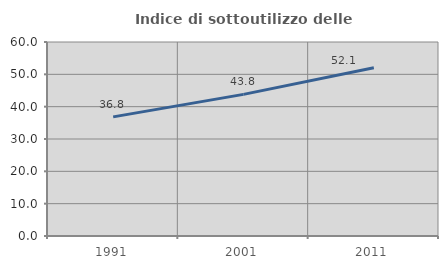
| Category | Indice di sottoutilizzo delle abitazioni  |
|---|---|
| 1991.0 | 36.846 |
| 2001.0 | 43.804 |
| 2011.0 | 52.052 |